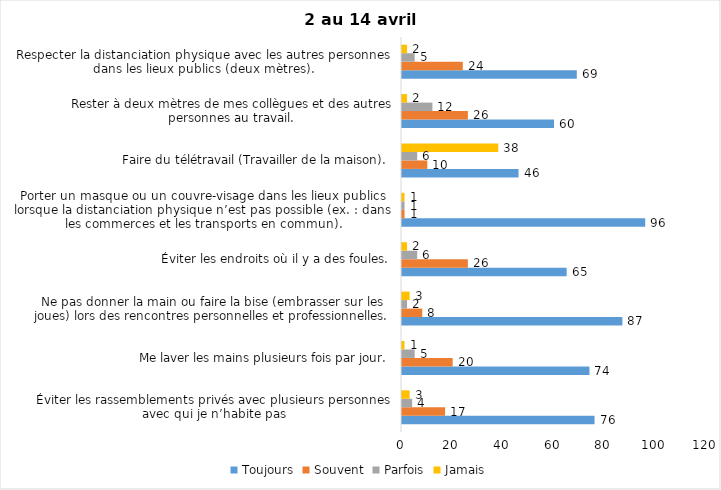
| Category | Toujours | Souvent | Parfois | Jamais |
|---|---|---|---|---|
| Éviter les rassemblements privés avec plusieurs personnes avec qui je n’habite pas | 76 | 17 | 4 | 3 |
| Me laver les mains plusieurs fois par jour. | 74 | 20 | 5 | 1 |
| Ne pas donner la main ou faire la bise (embrasser sur les joues) lors des rencontres personnelles et professionnelles. | 87 | 8 | 2 | 3 |
| Éviter les endroits où il y a des foules. | 65 | 26 | 6 | 2 |
| Porter un masque ou un couvre-visage dans les lieux publics lorsque la distanciation physique n’est pas possible (ex. : dans les commerces et les transports en commun). | 96 | 1 | 1 | 1 |
| Faire du télétravail (Travailler de la maison). | 46 | 10 | 6 | 38 |
| Rester à deux mètres de mes collègues et des autres personnes au travail. | 60 | 26 | 12 | 2 |
| Respecter la distanciation physique avec les autres personnes dans les lieux publics (deux mètres). | 69 | 24 | 5 | 2 |